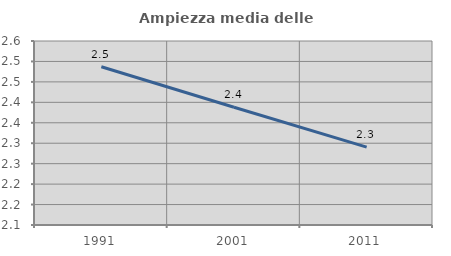
| Category | Ampiezza media delle famiglie |
|---|---|
| 1991.0 | 2.487 |
| 2001.0 | 2.388 |
| 2011.0 | 2.29 |